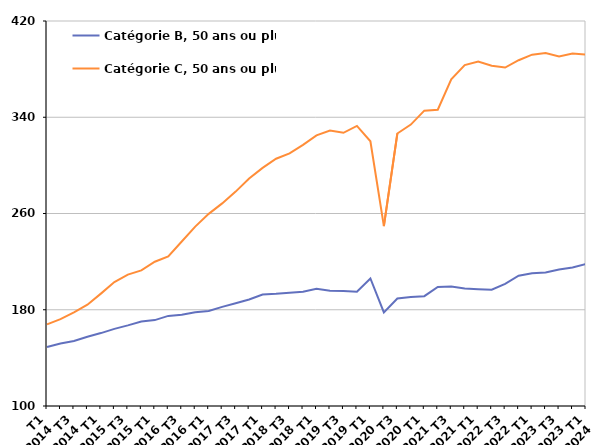
| Category | Catégorie B, 50 ans ou plus | Catégorie C, 50 ans ou plus |
|---|---|---|
| T1
2014 | 149.1 | 167.8 |
| T2
2014 | 152 | 172.2 |
| T3
2014 | 154 | 177.9 |
| T4
2014 | 157.6 | 184.2 |
| T1
2015 | 160.6 | 193.4 |
| T2
2015 | 164.1 | 203 |
| T3
2015 | 167 | 209.2 |
| T4
2015 | 170.2 | 212.7 |
| T1
2016 | 171.4 | 219.9 |
| T2
2016 | 174.9 | 224.3 |
| T3
2016 | 175.8 | 236.7 |
| T4
2016 | 178 | 249.1 |
| T1
2017 | 178.9 | 259.7 |
| T2
2017 | 182.4 | 268.4 |
| T3
2017 | 185.4 | 278.2 |
| T4
2017 | 188.5 | 289.1 |
| T1
2018 | 192.6 | 297.9 |
| T2
2018 | 193.2 | 305.5 |
| T3
2018 | 194.2 | 310 |
| T4
2018 | 195 | 317 |
| T1
2019 | 197.4 | 324.9 |
| T2
2019 | 195.8 | 329 |
| T3
2019 | 195.5 | 327.1 |
| T4
2019 | 194.9 | 332.8 |
| T1
2020 | 206 | 320 |
| T2
2020 | 177.8 | 249.5 |
| T3
2020 | 189.3 | 326.5 |
| T4
2020 | 190.6 | 333.9 |
| T1
2021 | 191.3 | 345.5 |
| T2
2021 | 199 | 346.3 |
| T3
2021 | 199.3 | 371.5 |
| T4
2021 | 197.7 | 383.3 |
| T1
2022 | 197.1 | 386.4 |
| T2
2022 | 196.7 | 382.8 |
| T3
2022 | 201.5 | 381.3 |
| T4
2022 | 208.3 | 387.4 |
| T1
2023 | 210.3 | 392 |
| T2
2023 | 210.9 | 393.4 |
| T3
2023 | 213.4 | 390.6 |
| T4
2023 | 215.2 | 392.9 |
| T1
2024 | 218.1 | 392.2 |